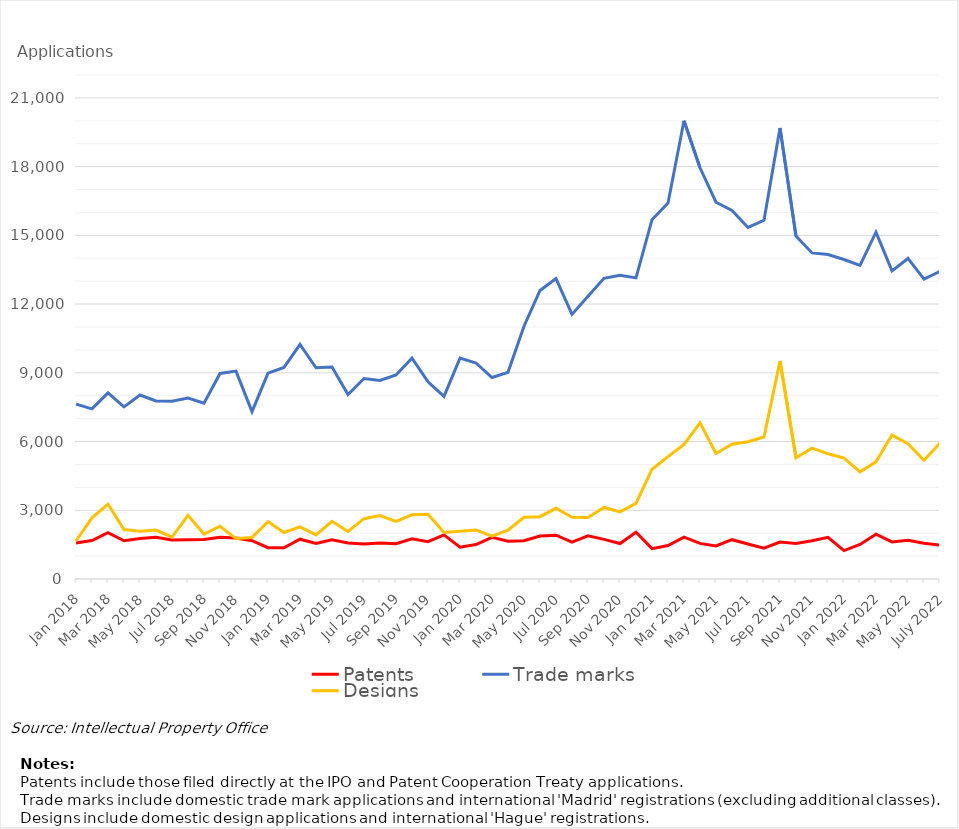
| Category | Patents | Trade marks | Designs |
|---|---|---|---|
| Jan 2018 | 1575 | 7634 | 1658 |
| Feb 2018 | 1676 | 7428 | 2672 |
| Mar 2018 | 2022 | 8127 | 3267 |
| Apr 2018 | 1670 | 7512 | 2160 |
| May 2018 | 1767 | 8030 | 2083 |
| Jun 2018 | 1821 | 7769 | 2136 |
| Jul 2018 | 1704 | 7757 | 1832 |
| Aug 2018 | 1713 | 7897 | 2777 |
| Sep 2018 | 1725 | 7673 | 1960 |
| Oct 2018 | 1818 | 8972 | 2302 |
| Nov 2018 | 1787 | 9076 | 1765 |
| Dec 2018 | 1670 | 7304 | 1815 |
| Jan 2019 | 1367 | 8985 | 2505 |
| Feb 2019 | 1361 | 9234 | 2031 |
| Mar 2019 | 1737 | 10243 | 2274 |
| Apr 2019 | 1552 | 9219 | 1923 |
| May 2019 | 1710 | 9251 | 2520 |
| Jun 2019 | 1569 | 8053 | 2074 |
| Jul 2019 | 1527 | 8752 | 2634 |
| Aug 2019 | 1571 | 8670 | 2768 |
| Sep 2019 | 1540 | 8907 | 2511 |
| Oct 2019 | 1755 | 9636 | 2800 |
| Nov 2019 | 1630 | 8607 | 2827 |
| Dec 2019 | 1926 | 7970 | 2028 |
| Jan 2020 | 1391 | 9642 | 2082 |
| Feb 2020 | 1504 | 9428 | 2143 |
| Mar 2020 | 1819 | 8794 | 1872 |
| Apr 2020 | 1648 | 9021 | 2127 |
| May 2020 | 1672 | 11035 | 2695 |
| Jun 2020 | 1879 | 12593 | 2721 |
| Jul 2020 | 1912 | 13110 | 3086 |
| Aug 2020 | 1614 | 11551 | 2695 |
| Sep 2020 | 1885 | 12340 | 2686 |
| Oct 2020 | 1730 | 13126 | 3124 |
| Nov 2020 | 1547 | 13254 | 2930 |
| Dec 2020 | 2042 | 13144 | 3302 |
| Jan 2021 | 1324 | 15685 | 4792 |
| Feb 2021 | 1462 | 16412 | 5340 |
| Mar 2021 | 1828 | 20001 | 5878 |
| Apr 2021 | 1554 | 17951 | 6815 |
| May 2021 | 1446 | 16446 | 5480 |
| Jun 2021 | 1716 | 16091 | 5881 |
| Jul 2021 | 1528 | 15345 | 5989 |
| Aug 2021 | 1344 | 15659 | 6200 |
| Sep 2021 | 1615 | 19685 | 9518 |
| Oct 2021 | 1547 | 14968 | 5289 |
| Nov 2021 | 1670 | 14233 | 5712 |
| Dec 2021 | 1817 | 14162 | 5464 |
| Jan 2022 | 1241 | 13945 | 5282 |
| Feb 2022 | 1508 | 13690 | 4679 |
| Mar 2022 | 1953 | 15141 | 5113 |
| Apr 2022 | 1617 | 13450 | 6282 |
| May 2022 | 1686 | 13992 | 5908 |
| June 2022 | 1558 | 13091 | 5180 |
| July 2022 | 1482 | 13426 | 5934 |